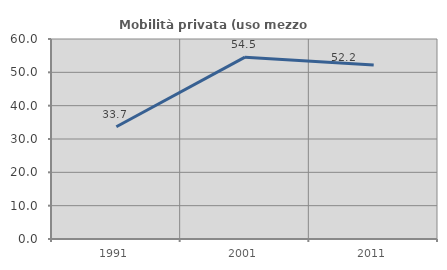
| Category | Mobilità privata (uso mezzo privato) |
|---|---|
| 1991.0 | 33.688 |
| 2001.0 | 54.545 |
| 2011.0 | 52.204 |